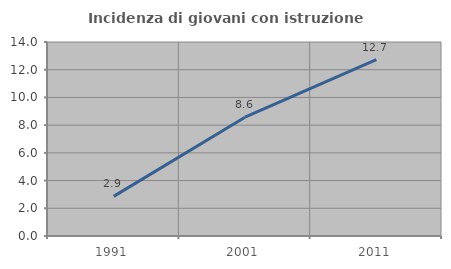
| Category | Incidenza di giovani con istruzione universitaria |
|---|---|
| 1991.0 | 2.857 |
| 2001.0 | 8.571 |
| 2011.0 | 12.727 |